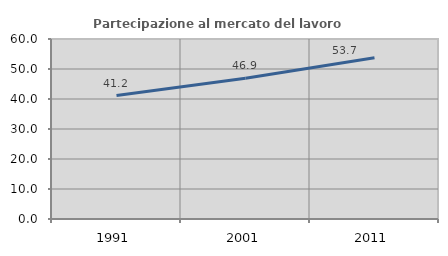
| Category | Partecipazione al mercato del lavoro  femminile |
|---|---|
| 1991.0 | 41.152 |
| 2001.0 | 46.947 |
| 2011.0 | 53.726 |